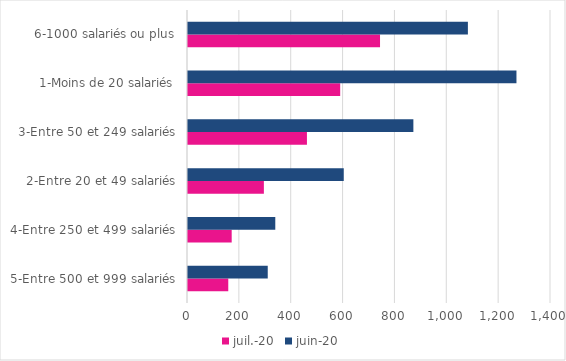
| Category | juil.-20 | juin-20 |
|---|---|---|
| 5-Entre 500 et 999 salariés | 155.295 | 307.554 |
| 4-Entre 250 et 499 salariés | 168.504 | 336.654 |
| 2-Entre 20 et 49 salariés | 292.641 | 600.712 |
| 3-Entre 50 et 249 salariés | 458.727 | 869.205 |
| 1-Moins de 20 salariés | 586.986 | 1266.776 |
| 6-1000 salariés ou plus | 740.606 | 1079.475 |